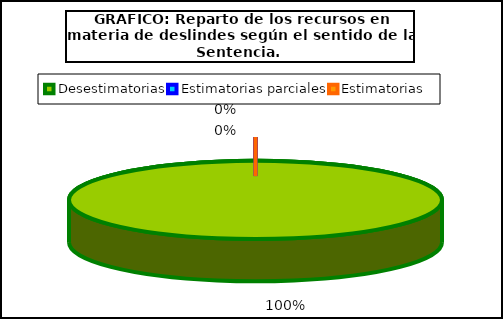
| Category | Número de recursos |
|---|---|
| Desestimatorias | 9 |
| Estimatorias parciales | 0 |
| Estimatorias  | 0 |